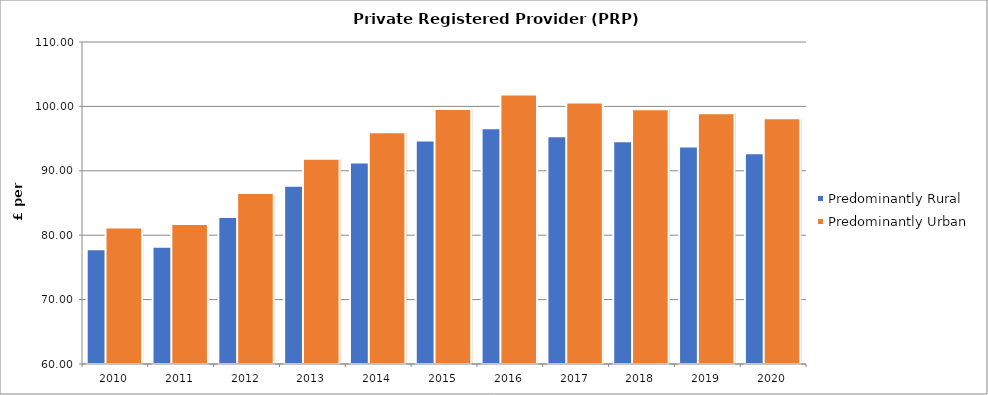
| Category | Predominantly Rural | Predominantly Urban |
|---|---|---|
| 2010.0 | 77.832 | 81.205 |
| 2011.0 | 78.2 | 81.735 |
| 2012.0 | 82.807 | 86.541 |
| 2013.0 | 87.679 | 91.868 |
| 2014.0 | 91.289 | 96.003 |
| 2015.0 | 94.691 | 99.58 |
| 2016.0 | 96.59 | 101.844 |
| 2017.0 | 95.381 | 100.615 |
| 2018.0 | 94.599 | 99.565 |
| 2019.0 | 93.755 | 98.955 |
| 2020.0 | 92.709 | 98.158 |